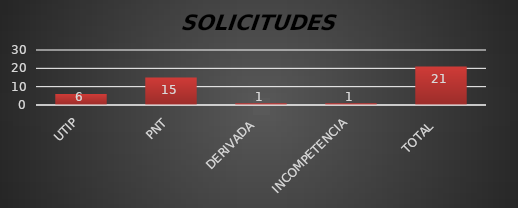
| Category | Series 1 |
|---|---|
| UTIP | 6 |
| PNT | 15 |
| DERIVADA  | 1 |
| INCOMPETENCIA | 1 |
| TOTAL  | 21 |